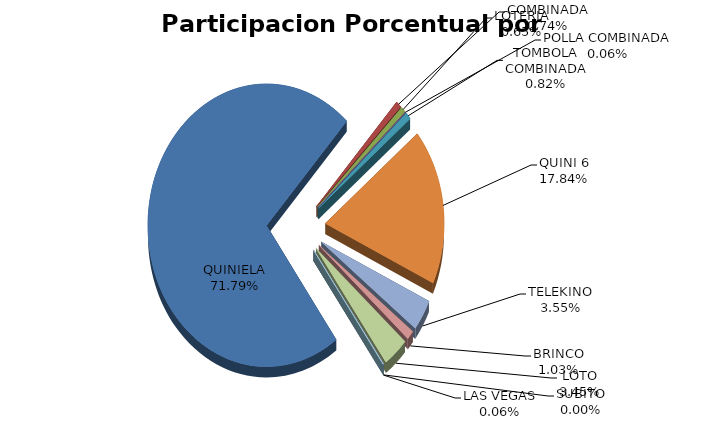
| Category | Series 0 |
|---|---|
| QUINIELA | 11485926.39 |
| COMBINADA | 118286.01 |
| LOTERIA | 104406.48 |
| POLLA COMBINADA | 9813.44 |
| TOMBOLA COMBINADA | 131436 |
| QUINI 6 | 2854697.21 |
| TELEKINO | 567383.7 |
| BRINCO | 165292.628 |
| LOTO | 552084.658 |
| SUBITO | 0 |
| LAS VEGAS | 9023.94 |